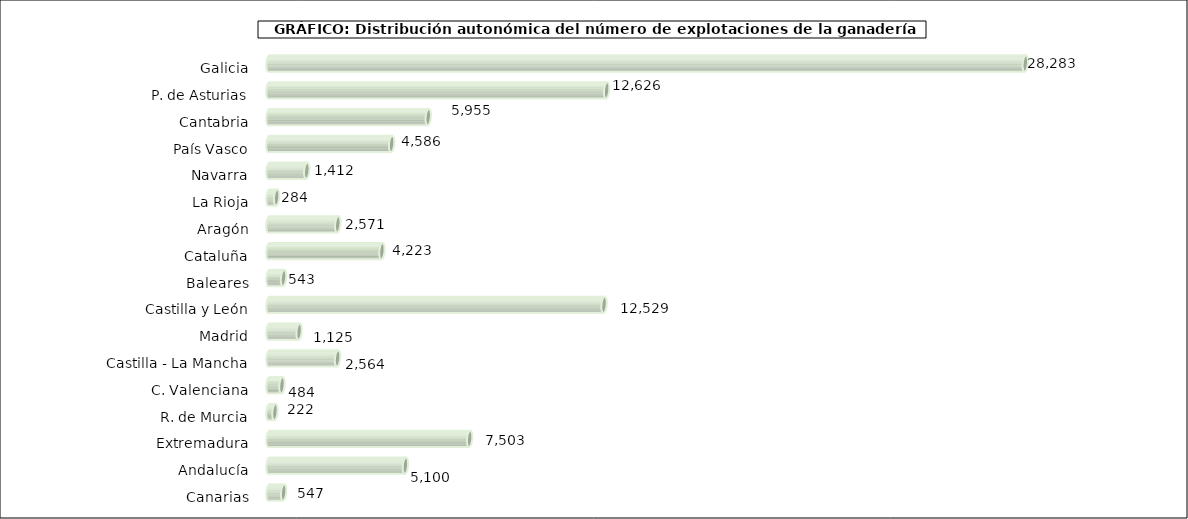
| Category | num. Explotaciones |
|---|---|
|   Galicia | 28283 |
|   P. de Asturias | 12626 |
|   Cantabria | 5955 |
|   País Vasco | 4586 |
|   Navarra | 1412 |
|   La Rioja | 284 |
|   Aragón | 2571 |
|   Cataluña | 4223 |
|   Baleares | 543 |
|   Castilla y León | 12529 |
|   Madrid | 1125 |
|   Castilla - La Mancha | 2564 |
|   C. Valenciana | 484 |
|   R. de Murcia | 222 |
|   Extremadura | 7503 |
|   Andalucía | 5100 |
|   Canarias | 547 |